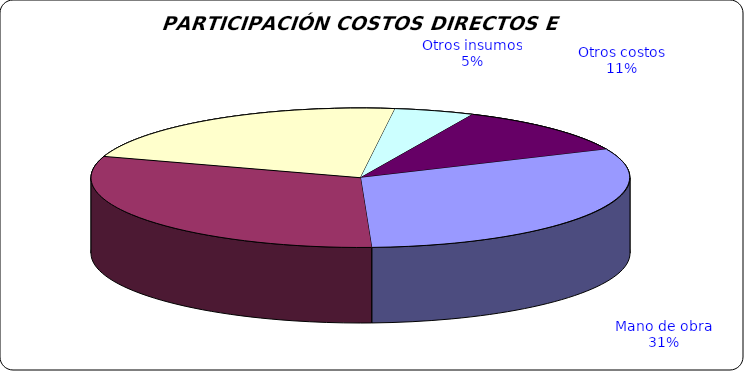
| Category | Series 0 |
|---|---|
| Mano de obra | 2590000 |
| Fertilizantes | 2557100 |
| Control sanitario | 1846342.5 |
| Otros insumos | 400000 |
| Otros costos | 960000 |